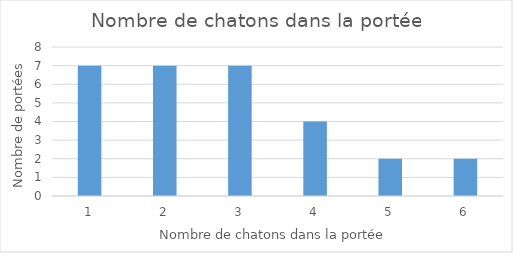
| Category | Series 0 |
|---|---|
| 1.0 | 7 |
| 2.0 | 7 |
| 3.0 | 7 |
| 4.0 | 4 |
| 5.0 | 2 |
| 6.0 | 2 |